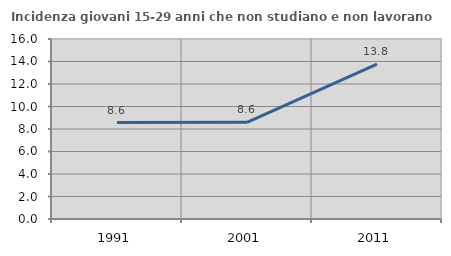
| Category | Incidenza giovani 15-29 anni che non studiano e non lavorano  |
|---|---|
| 1991.0 | 8.576 |
| 2001.0 | 8.599 |
| 2011.0 | 13.765 |